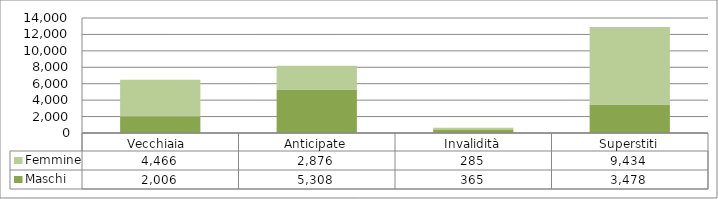
| Category | Maschi | Femmine |
|---|---|---|
| Vecchiaia  | 2006 | 4466 |
| Anticipate | 5308 | 2876 |
| Invalidità | 365 | 285 |
| Superstiti | 3478 | 9434 |